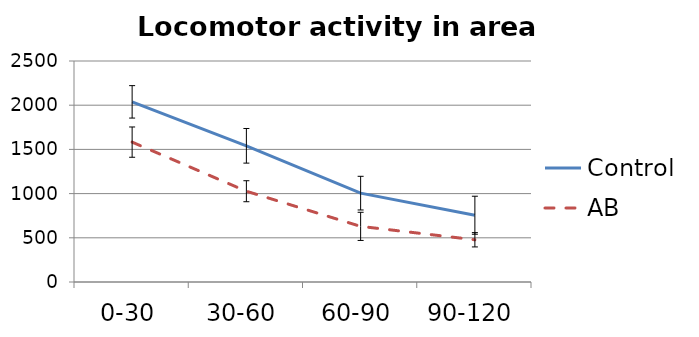
| Category | Control | AB |
|---|---|---|
| 0-30 | 2037.905 | 1582.444 |
| 30-60 | 1540.667 | 1026.889 |
| 60-90 | 1005.143 | 629.333 |
| 90-120 | 755.381 | 477.667 |